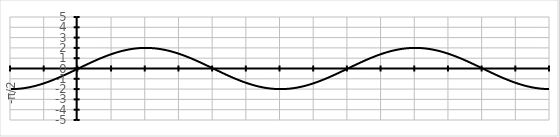
| Category | Series 0 |
|---|---|
| -π/2 | -2 |
|  | -2 |
|  | -1.999 |
|  | -1.997 |
|  | -1.995 |
|  | -1.992 |
|  | -1.989 |
|  | -1.985 |
|  | -1.981 |
|  | -1.975 |
|  | -1.97 |
|  | -1.963 |
|  | -1.956 |
|  | -1.949 |
|  | -1.941 |
|  | -1.932 |
|  | -1.923 |
|  | -1.913 |
|  | -1.902 |
|  | -1.891 |
|  | -1.879 |
|  | -1.867 |
|  | -1.854 |
|  | -1.841 |
|  | -1.827 |
|  | -1.813 |
|  | -1.798 |
|  | -1.782 |
|  | -1.766 |
|  | -1.749 |
|  | -1.732 |
|  | -1.714 |
|  | -1.696 |
|  | -1.677 |
|  | -1.658 |
|  | -1.638 |
|  | -1.618 |
|  | -1.597 |
|  | -1.576 |
|  | -1.554 |
|  | -1.532 |
|  | -1.509 |
|  | -1.486 |
|  | -1.463 |
|  | -1.439 |
|   | -1.414 |
|  | -1.389 |
|  | -1.364 |
|  | -1.338 |
|  | -1.312 |
|  | -1.286 |
|  | -1.259 |
|  | -1.231 |
|  | -1.204 |
|  | -1.176 |
|  | -1.147 |
|  | -1.118 |
|  | -1.089 |
|  | -1.06 |
|  | -1.03 |
|  | -1 |
|  | -0.97 |
|  | -0.939 |
|  | -0.908 |
|  | -0.877 |
|  | -0.845 |
|  | -0.813 |
|  | -0.781 |
|  | -0.749 |
|  | -0.717 |
|  | -0.684 |
|  | -0.651 |
|  | -0.618 |
|  | -0.585 |
|  | -0.551 |
|  | -0.518 |
|  | -0.484 |
|  | -0.45 |
|  | -0.416 |
|  | -0.382 |
|  | -0.347 |
|  | -0.313 |
|  | -0.278 |
|  | -0.244 |
|  | -0.209 |
|  | -0.174 |
|  | -0.14 |
|  | -0.105 |
|  | -0.07 |
|  | -0.035 |
| 0 | 0 |
|  | 0.035 |
|  | 0.07 |
|  | 0.105 |
|  | 0.14 |
|  | 0.174 |
|  | 0.209 |
|  | 0.244 |
|  | 0.278 |
|  | 0.313 |
|  | 0.347 |
|  | 0.382 |
|  | 0.416 |
|  | 0.45 |
|  | 0.484 |
|  | 0.518 |
|  | 0.551 |
|  | 0.585 |
|  | 0.618 |
|  | 0.651 |
|  | 0.684 |
|  | 0.717 |
|  | 0.749 |
|  | 0.781 |
|  | 0.813 |
|  | 0.845 |
|  | 0.877 |
|  | 0.908 |
|  | 0.939 |
|  | 0.97 |
|  | 1 |
|  | 1.03 |
|  | 1.06 |
|  | 1.089 |
|  | 1.118 |
|  | 1.147 |
|  | 1.176 |
|  | 1.204 |
|  | 1.231 |
|  | 1.259 |
|  | 1.286 |
|  | 1.312 |
|  | 1.338 |
|  | 1.364 |
|  | 1.389 |
|   | 1.414 |
|  | 1.439 |
|  | 1.463 |
|  | 1.486 |
|  | 1.509 |
|  | 1.532 |
|  | 1.554 |
|  | 1.576 |
|  | 1.597 |
|  | 1.618 |
|  | 1.638 |
|  | 1.658 |
|  | 1.677 |
|  | 1.696 |
|  | 1.714 |
|  | 1.732 |
|  | 1.749 |
|  | 1.766 |
|  | 1.782 |
|  | 1.798 |
|  | 1.813 |
|  | 1.827 |
|  | 1.841 |
|  | 1.854 |
|  | 1.867 |
|  | 1.879 |
|  | 1.891 |
|  | 1.902 |
|  | 1.913 |
|  | 1.923 |
|  | 1.932 |
|  | 1.941 |
|  | 1.949 |
|  | 1.956 |
|  | 1.963 |
|  | 1.97 |
|  | 1.975 |
|  | 1.981 |
|  | 1.985 |
|  | 1.989 |
|  | 1.992 |
|  | 1.995 |
|  | 1.997 |
|  | 1.999 |
|  | 2 |
| π/2 | 2 |
|  | 2 |
|  | 1.999 |
|  | 1.997 |
|  | 1.995 |
|  | 1.992 |
|  | 1.989 |
|  | 1.985 |
|  | 1.981 |
|  | 1.975 |
|  | 1.97 |
|  | 1.963 |
|  | 1.956 |
|  | 1.949 |
|  | 1.941 |
|  | 1.932 |
|  | 1.923 |
|  | 1.913 |
|  | 1.902 |
|  | 1.891 |
|  | 1.879 |
|  | 1.867 |
|  | 1.854 |
|  | 1.841 |
|  | 1.827 |
|  | 1.813 |
|  | 1.798 |
|  | 1.782 |
|  | 1.766 |
|  | 1.749 |
|  | 1.732 |
|  | 1.714 |
|  | 1.696 |
|  | 1.677 |
|  | 1.658 |
|  | 1.638 |
|  | 1.618 |
|  | 1.597 |
|  | 1.576 |
|  | 1.554 |
|  | 1.532 |
|  | 1.509 |
|  | 1.486 |
|  | 1.463 |
|  | 1.439 |
|   | 1.414 |
|  | 1.389 |
|  | 1.364 |
|  | 1.338 |
|  | 1.312 |
|  | 1.286 |
|  | 1.259 |
|  | 1.231 |
|  | 1.204 |
|  | 1.176 |
|  | 1.147 |
|  | 1.118 |
|  | 1.089 |
|  | 1.06 |
|  | 1.03 |
|  | 1 |
|  | 0.97 |
|  | 0.939 |
|  | 0.908 |
|  | 0.877 |
|  | 0.845 |
|  | 0.813 |
|  | 0.781 |
|  | 0.749 |
|  | 0.717 |
|  | 0.684 |
|  | 0.651 |
|  | 0.618 |
|  | 0.585 |
|  | 0.551 |
|  | 0.518 |
|  | 0.484 |
|  | 0.45 |
|  | 0.416 |
|  | 0.382 |
|  | 0.347 |
|  | 0.313 |
|  | 0.278 |
|  | 0.244 |
|  | 0.209 |
|  | 0.174 |
|  | 0.14 |
|  | 0.105 |
|  | 0.07 |
|  | 0.035 |
| π | 0 |
|  | -0.035 |
|  | -0.07 |
|  | -0.105 |
|  | -0.14 |
|  | -0.174 |
|  | -0.209 |
|  | -0.244 |
|  | -0.278 |
|  | -0.313 |
|  | -0.347 |
|  | -0.382 |
|  | -0.416 |
|  | -0.45 |
|  | -0.484 |
|  | -0.518 |
|  | -0.551 |
|  | -0.585 |
|  | -0.618 |
|  | -0.651 |
|  | -0.684 |
|  | -0.717 |
|  | -0.749 |
|  | -0.781 |
|  | -0.813 |
|  | -0.845 |
|  | -0.877 |
|  | -0.908 |
|  | -0.939 |
|  | -0.97 |
|  | -1 |
|  | -1.03 |
|  | -1.06 |
|  | -1.089 |
|  | -1.118 |
|  | -1.147 |
|  | -1.176 |
|  | -1.204 |
|  | -1.231 |
|  | -1.259 |
|  | -1.286 |
|  | -1.312 |
|  | -1.338 |
|  | -1.364 |
|  | -1.389 |
|   | -1.414 |
|  | -1.439 |
|  | -1.463 |
|  | -1.486 |
|  | -1.509 |
|  | -1.532 |
|  | -1.554 |
|  | -1.576 |
|  | -1.597 |
|  | -1.618 |
|  | -1.638 |
|  | -1.658 |
|  | -1.677 |
|  | -1.696 |
|  | -1.714 |
|  | -1.732 |
|  | -1.749 |
|  | -1.766 |
|  | -1.782 |
|  | -1.798 |
|  | -1.813 |
|  | -1.827 |
|  | -1.841 |
|  | -1.854 |
|  | -1.867 |
|  | -1.879 |
|  | -1.891 |
|  | -1.902 |
|  | -1.913 |
|  | -1.923 |
|  | -1.932 |
|  | -1.941 |
|  | -1.949 |
|  | -1.956 |
|  | -1.963 |
|  | -1.97 |
|  | -1.975 |
|  | -1.981 |
|  | -1.985 |
|  | -1.989 |
|  | -1.992 |
|  | -1.995 |
|  | -1.997 |
|  | -1.999 |
|  | -2 |
| 3π/2 | -2 |
|  | -2 |
|  | -1.999 |
|  | -1.997 |
|  | -1.995 |
|  | -1.992 |
|  | -1.989 |
|  | -1.985 |
|  | -1.981 |
|  | -1.975 |
|  | -1.97 |
|  | -1.963 |
|  | -1.956 |
|  | -1.949 |
|  | -1.941 |
|  | -1.932 |
|  | -1.923 |
|  | -1.913 |
|  | -1.902 |
|  | -1.891 |
|  | -1.879 |
|  | -1.867 |
|  | -1.854 |
|  | -1.841 |
|  | -1.827 |
|  | -1.813 |
|  | -1.798 |
|  | -1.782 |
|  | -1.766 |
|  | -1.749 |
|  | -1.732 |
|  | -1.714 |
|  | -1.696 |
|  | -1.677 |
|  | -1.658 |
|  | -1.638 |
|  | -1.618 |
|  | -1.597 |
|  | -1.576 |
|  | -1.554 |
|  | -1.532 |
|  | -1.509 |
|  | -1.486 |
|  | -1.463 |
|  | -1.439 |
|   | -1.414 |
|  | -1.389 |
|  | -1.364 |
|  | -1.338 |
|  | -1.312 |
|  | -1.286 |
|  | -1.259 |
|  | -1.231 |
|  | -1.204 |
|  | -1.176 |
|  | -1.147 |
|  | -1.118 |
|  | -1.089 |
|  | -1.06 |
|  | -1.03 |
|  | -1 |
|  | -0.97 |
|  | -0.939 |
|  | -0.908 |
|  | -0.877 |
|  | -0.845 |
|  | -0.813 |
|  | -0.781 |
|  | -0.749 |
|  | -0.717 |
|  | -0.684 |
|  | -0.651 |
|  | -0.618 |
|  | -0.585 |
|  | -0.551 |
|  | -0.518 |
|  | -0.484 |
|  | -0.45 |
|  | -0.416 |
|  | -0.382 |
|  | -0.347 |
|  | -0.313 |
|  | -0.278 |
|  | -0.244 |
|  | -0.209 |
|  | -0.174 |
|  | -0.14 |
|  | -0.105 |
|  | -0.07 |
|  | -0.035 |
| 2π | 0 |
|  | 0.035 |
|  | 0.07 |
|  | 0.105 |
|  | 0.14 |
|  | 0.174 |
|  | 0.209 |
|  | 0.244 |
|  | 0.278 |
|  | 0.313 |
|  | 0.347 |
|  | 0.382 |
|  | 0.416 |
|  | 0.45 |
|  | 0.484 |
|  | 0.518 |
|  | 0.551 |
|  | 0.585 |
|  | 0.618 |
|  | 0.651 |
|  | 0.684 |
|  | 0.717 |
|  | 0.749 |
|  | 0.781 |
|  | 0.813 |
|  | 0.845 |
|  | 0.877 |
|  | 0.908 |
|  | 0.939 |
|  | 0.97 |
|  | 1 |
|  | 1.03 |
|  | 1.06 |
|  | 1.089 |
|  | 1.118 |
|  | 1.147 |
|  | 1.176 |
|  | 1.204 |
|  | 1.231 |
|  | 1.259 |
|  | 1.286 |
|  | 1.312 |
|  | 1.338 |
|  | 1.364 |
|  | 1.389 |
|   | 1.414 |
|  | 1.439 |
|  | 1.463 |
|  | 1.486 |
|  | 1.509 |
|  | 1.532 |
|  | 1.554 |
|  | 1.576 |
|  | 1.597 |
|  | 1.618 |
|  | 1.638 |
|  | 1.658 |
|  | 1.677 |
|  | 1.696 |
|  | 1.714 |
|  | 1.732 |
|  | 1.749 |
|  | 1.766 |
|  | 1.782 |
|  | 1.798 |
|  | 1.813 |
|  | 1.827 |
|  | 1.841 |
|  | 1.854 |
|  | 1.867 |
|  | 1.879 |
|  | 1.891 |
|  | 1.902 |
|  | 1.913 |
|  | 1.923 |
|  | 1.932 |
|  | 1.941 |
|  | 1.949 |
|  | 1.956 |
|  | 1.963 |
|  | 1.97 |
|  | 1.975 |
|  | 1.981 |
|  | 1.985 |
|  | 1.989 |
|  | 1.992 |
|  | 1.995 |
|  | 1.997 |
|  | 1.999 |
|  | 2 |
| 5π/2 | 2 |
|  | 2 |
|  | 1.999 |
|  | 1.997 |
|  | 1.995 |
|  | 1.992 |
|  | 1.989 |
|  | 1.985 |
|  | 1.981 |
|  | 1.975 |
|  | 1.97 |
|  | 1.963 |
|  | 1.956 |
|  | 1.949 |
|  | 1.941 |
|  | 1.932 |
|  | 1.923 |
|  | 1.913 |
|  | 1.902 |
|  | 1.891 |
|  | 1.879 |
|  | 1.867 |
|  | 1.854 |
|  | 1.841 |
|  | 1.827 |
|  | 1.813 |
|  | 1.798 |
|  | 1.782 |
|  | 1.766 |
|  | 1.749 |
|  | 1.732 |
|  | 1.714 |
|  | 1.696 |
|  | 1.677 |
|  | 1.658 |
|  | 1.638 |
|  | 1.618 |
|  | 1.597 |
|  | 1.576 |
|  | 1.554 |
|  | 1.532 |
|  | 1.509 |
|  | 1.486 |
|  | 1.463 |
|  | 1.439 |
|   | 1.414 |
|  | 1.389 |
|  | 1.364 |
|  | 1.338 |
|  | 1.312 |
|  | 1.286 |
|  | 1.259 |
|  | 1.231 |
|  | 1.204 |
|  | 1.176 |
|  | 1.147 |
|  | 1.118 |
|  | 1.089 |
|  | 1.06 |
|  | 1.03 |
|  | 1 |
|  | 0.97 |
|  | 0.939 |
|  | 0.908 |
|  | 0.877 |
|  | 0.845 |
|  | 0.813 |
|  | 0.781 |
|  | 0.749 |
|  | 0.717 |
|  | 0.684 |
|  | 0.651 |
|  | 0.618 |
|  | 0.585 |
|  | 0.551 |
|  | 0.518 |
|  | 0.484 |
|  | 0.45 |
|  | 0.416 |
|  | 0.382 |
|  | 0.347 |
|  | 0.313 |
|  | 0.278 |
|  | 0.244 |
|  | 0.209 |
|  | 0.174 |
|  | 0.14 |
|  | 0.105 |
|  | 0.07 |
|  | 0.035 |
| 3π | 0 |
|  | -0.035 |
|  | -0.07 |
|  | -0.105 |
|  | -0.14 |
|  | -0.174 |
|  | -0.209 |
|  | -0.244 |
|  | -0.278 |
|  | -0.313 |
|  | -0.347 |
|  | -0.382 |
|  | -0.416 |
|  | -0.45 |
|  | -0.484 |
|  | -0.518 |
|  | -0.551 |
|  | -0.585 |
|  | -0.618 |
|  | -0.651 |
|  | -0.684 |
|  | -0.717 |
|  | -0.749 |
|  | -0.781 |
|  | -0.813 |
|  | -0.845 |
|  | -0.877 |
|  | -0.908 |
|  | -0.939 |
|  | -0.97 |
|  | -1 |
|  | -1.03 |
|  | -1.06 |
|  | -1.089 |
|  | -1.118 |
|  | -1.147 |
|  | -1.176 |
|  | -1.204 |
|  | -1.231 |
|  | -1.259 |
|  | -1.286 |
|  | -1.312 |
|  | -1.338 |
|  | -1.364 |
|  | -1.389 |
|   | -1.414 |
|  | -1.439 |
|  | -1.463 |
|  | -1.486 |
|  | -1.509 |
|  | -1.532 |
|  | -1.554 |
|  | -1.576 |
|  | -1.597 |
|  | -1.618 |
|  | -1.638 |
|  | -1.658 |
|  | -1.677 |
|  | -1.696 |
|  | -1.714 |
|  | -1.732 |
|  | -1.749 |
|  | -1.766 |
|  | -1.782 |
|  | -1.798 |
|  | -1.813 |
|  | -1.827 |
|  | -1.841 |
|  | -1.854 |
|  | -1.867 |
|  | -1.879 |
|  | -1.891 |
|  | -1.902 |
|  | -1.913 |
|  | -1.923 |
|  | -1.932 |
|  | -1.941 |
|  | -1.949 |
|  | -1.956 |
|  | -1.963 |
|  | -1.97 |
|  | -1.975 |
|  | -1.981 |
|  | -1.985 |
|  | -1.989 |
|  | -1.992 |
|  | -1.995 |
|  | -1.997 |
|  | -1.999 |
|  | -2 |
| 7π/2 | -2 |